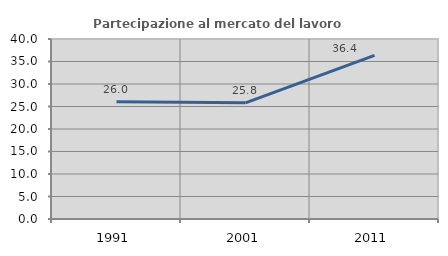
| Category | Partecipazione al mercato del lavoro  femminile |
|---|---|
| 1991.0 | 26.038 |
| 2001.0 | 25.82 |
| 2011.0 | 36.364 |